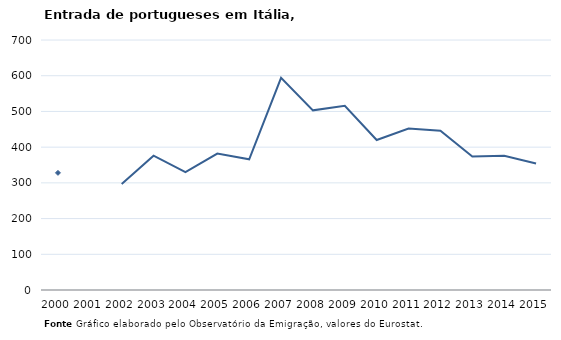
| Category | Entradas |
|---|---|
| 2000.0 | 328 |
| 2001.0 | 0 |
| 2002.0 | 297 |
| 2003.0 | 376 |
| 2004.0 | 330 |
| 2005.0 | 382 |
| 2006.0 | 366 |
| 2007.0 | 594 |
| 2008.0 | 503 |
| 2009.0 | 516 |
| 2010.0 | 420 |
| 2011.0 | 452 |
| 2012.0 | 446 |
| 2013.0 | 374 |
| 2014.0 | 376 |
| 2015.0 | 354 |